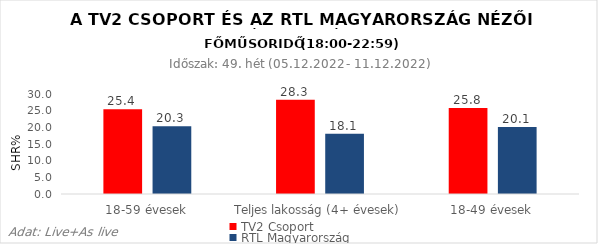
| Category | TV2 Csoport | RTL Magyarország |
|---|---|---|
| 18-59 évesek | 25.4 | 20.3 |
| Teljes lakosság (4+ évesek) | 28.3 | 18.1 |
| 18-49 évesek | 25.8 | 20.1 |